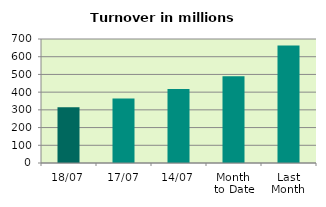
| Category | Series 0 |
|---|---|
| 18/07 | 314.879 |
| 17/07 | 363.784 |
| 14/07 | 417.461 |
| Month 
to Date | 489.932 |
| Last
Month | 663.186 |